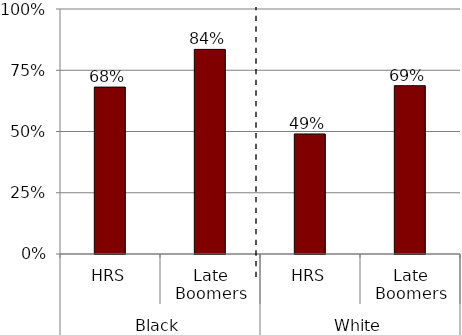
| Category | Women as % of men |
|---|---|
| 0 | 0.681 |
| 1 | 0.835 |
| 2 | 0.49 |
| 3 | 0.687 |